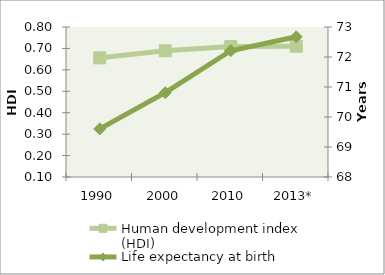
| Category | Human development index (HDI) |
|---|---|
| 1990 | 0.656 |
| 2000 | 0.689 |
| 2010 | 0.709 |
| 2013* | 0.71 |